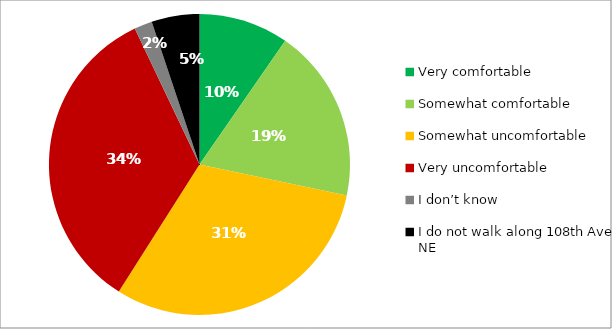
| Category | Responses |
|---|---|
| Very comfortable | 0.096 |
| Somewhat comfortable | 0.186 |
| Somewhat uncomfortable | 0.307 |
| Very uncomfortable | 0.339 |
| I don’t know | 0.019 |
| I do not walk along 108th Ave NE | 0.051 |